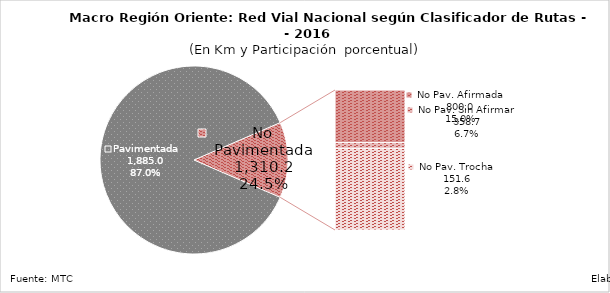
| Category | Series 0 |
|---|---|
| Pavimentada | 1884.962 |
| No Pavimentada                   Afirmada | 106.057 |
| No Pavimentada                   Sin Afirmar | 11.595 |
| No Pavimentada                            Trocha | 164.515 |